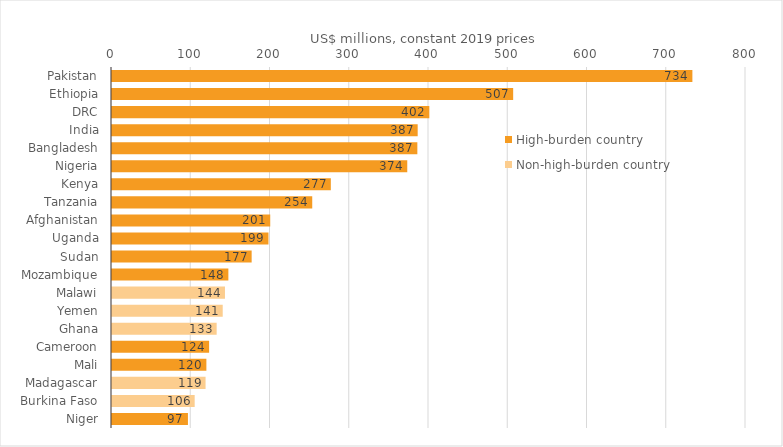
| Category | High-burden country | Non-high-burden country |
|---|---|---|
| Pakistan | 733.607 | 0 |
| Ethiopia | 507.463 | 0 |
| DRC | 401.68 | 0 |
| India | 386.973 | 0 |
| Bangladesh | 386.555 | 0 |
| Nigeria | 373.827 | 0 |
| Kenya | 277.39 | 0 |
| Tanzania | 253.922 | 0 |
| Afghanistan | 200.919 | 0 |
| Uganda | 198.698 | 0 |
| Sudan | 177.47 | 0 |
| Mozambique | 148.1 | 0 |
| Malawi | 0 | 143.816 |
| Yemen | 0 | 140.97 |
| Ghana | 0 | 133.324 |
| Cameroon | 123.798 | 0 |
| Mali | 120.353 | 0 |
| Madagascar | 0 | 119.323 |
| Burkina Faso | 0 | 105.589 |
| Niger | 97.084 | 0 |